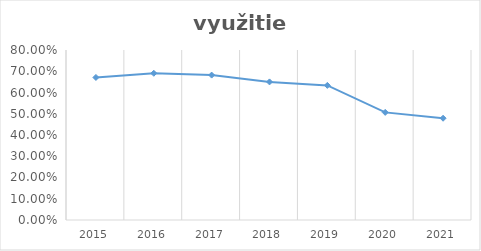
| Category | využitie LF |
|---|---|
| 2015.0 | 0.671 |
| 2016.0 | 0.69 |
| 2017.0 | 0.682 |
| 2018.0 | 0.65 |
| 2019.0 | 0.634 |
| 2020.0 | 0.506 |
| 2021.0 | 0.479 |